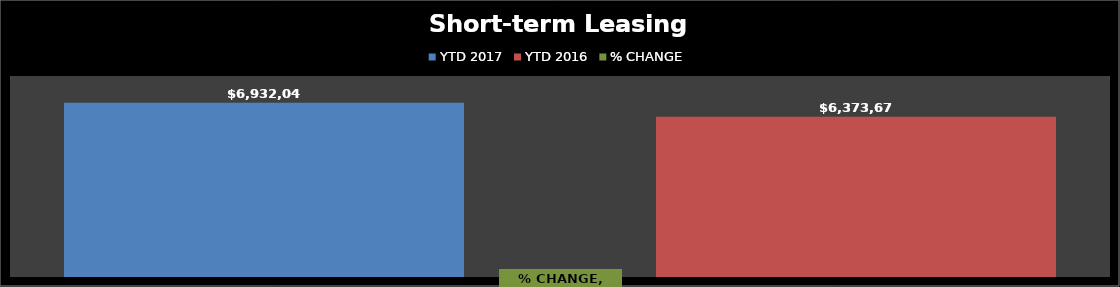
| Category | YTD 2017 | YTD 2016 |
|---|---|---|
| 0 | 6932049.31 | 6373678.55 |